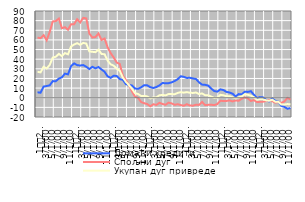
| Category | Домаћи кредити | Спољни дуг | Укупан дуг привреде |
|---|---|---|---|
| 1
2007. | 5.637 | 62.343 | 26.984 |
| 2 | 5.185 | 61.84 | 26.296 |
| 3 | 11.577 | 64.895 | 32.152 |
| 4 | 12.149 | 59.566 | 30.321 |
| 5 | 12.919 | 68.297 | 34.078 |
| 6 | 17.232 | 79.172 | 41.663 |
| 7 | 17.199 | 79.562 | 42.524 |
| 8 | 19.837 | 82.164 | 45.532 |
| 9 | 21.224 | 72.134 | 43.147 |
| 10 | 24.998 | 73.173 | 46.325 |
| 11 | 24.286 | 70.558 | 45.065 |
| 12 | 32.705 | 76.238 | 53.175 |
| 1
2008. | 35.667 | 76.343 | 55.244 |
| 2 | 33.835 | 81.494 | 56.592 |
| 3 | 33.412 | 78.061 | 54.911 |
| 4 | 33.892 | 82.918 | 56.896 |
| 5 | 32.108 | 82.333 | 56.195 |
| 6 | 29.728 | 66.52 | 48.083 |
| 7 | 32.098 | 62.534 | 47.67 |
| 8 | 30.52 | 62.97 | 47.265 |
| 9 | 31.877 | 66.704 | 49.911 |
| 10 | 29.324 | 59.923 | 45.356 |
| 11 | 26.955 | 61.443 | 45.164 |
| 12 | 22.178 | 52.362 | 38.508 |
| 1
2009. | 20.614 | 46.328 | 34.672 |
| 2 | 22.841 | 41.717 | 33.288 |
| 3 | 22.568 | 36.482 | 30.269 |
| 4 | 19.325 | 34.963 | 27.88 |
| 5 | 18.59 | 22.842 | 20.97 |
| 6 | 14.129 | 18.263 | 16.448 |
| 7 | 13.091 | 13.097 | 13.094 |
| 8 | 12.751 | 6.571 | 9.222 |
| 9 | 9.59 | 1.112 | 4.708 |
| 10 | 9.208 | -0.119 | 3.832 |
| 11 | 10.808 | -4.481 | 1.83 |
| 12 | 13.059 | -5.703 | 1.893 |
| 1
2010. | 12.865 | -6.566 | 1.323 |
| 2 | 10.935 | -8.875 | -0.722 |
| 3 | 10.114 | -6.803 | 0.305 |
| 4 | 11.094 | -7.461 | 0.382 |
| 5 | 12.84 | -5.282 | 2.538 |
| 6 | 15.268 | -6.452 | 2.893 |
| 7 | 15.023 | -7.335 | 2.432 |
| 8 | 15.114 | -5.134 | 3.832 |
| 9 | 15.944 | -5.88 | 3.809 |
| 10 | 17.345 | -7.375 | 3.637 |
| 11 | 19.272 | -6.687 | 4.974 |
| 12 | 22.295 | -7.646 | 5.804 |
| 1
2011. | 21.645 | -8.273 | 5.257 |
| 2 | 20.53 | -6.692 | 5.827 |
| 3 | 20.724 | -8.132 | 5.177 |
| 4 | 19.998 | -8.227 | 4.975 |
| 5 | 19.442 | -7.263 | 5.418 |
| 6 | 15.909 | -7.451 | 3.809 |
| 7 | 13.628 | -4.401 | 4.444 |
| 8 | 13.367 | -7.711 | 2.637 |
| 9 | 12.586 | -7.389 | 2.516 |
| 10 | 9.49 | -7.274 | 1.182 |
| 11 | 6.899 | -7.658 | -0.229 |
| 12 | 6.317 | -6.544 | 0.134 |
| 1
2012. | 8.667 | -3.156 | 3.023 |
| 2 | 7.963 | -3.408 | 2.548 |
| 3 | 6.034 | -3.336 | 1.624 |
| 4 | 5.436 | -2.825 | 1.592 |
| 5 | 4.186 | -3.819 | 0.488 |
| 6 | 1.288 | -2.831 | -0.614 |
| 7 | 3.756 | -3.211 | 0.507 |
| 8 | 3.432 | -1.048 | 1.381 |
| 9 | 6.239 | 0.394 | 3.577 |
| 10 | 6.042 | -0.599 | 3.026 |
| 11 | 6.765 | -3.375 | 2.17 |
| 12 | 3.101 | -2.515 | 0.581 |
| 1
2013. | -0.274 | -4.387 | -2.12 |
| 2 | 0.623 | -4.285 | -1.579 |
| 3 | 0.322 | -4.167 | -1.688 |
| 4 | -2.282 | -3.197 | -2.689 |
| 5 | -3.815 | -2.434 | -3.204 |
| 6 | -0.78 | -3.481 | -1.999 |
| 7 | -3.231 | -5.081 | -4.062 |
| 8 | -4.166 | -4.462 | -4.298 |
| 9 | -8.405 | -5.446 | -7.099 |
| 10 | -9.529 | -3.901 | -7.062 |
| 11 | -11.423 | -0.097 | -6.569 |
| 12 | -10.733 | -1.905 | -6.894 |